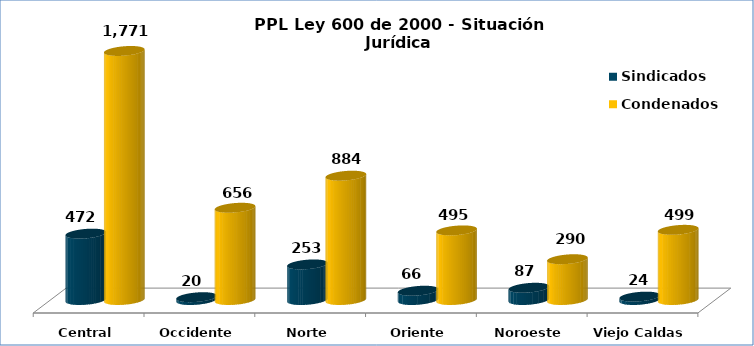
| Category | Sindicados | Condenados |
|---|---|---|
| Central | 472 | 1771 |
| Occidente | 20 | 656 |
| Norte | 253 | 884 |
| Oriente | 66 | 495 |
| Noroeste | 87 | 290 |
| Viejo Caldas | 24 | 499 |